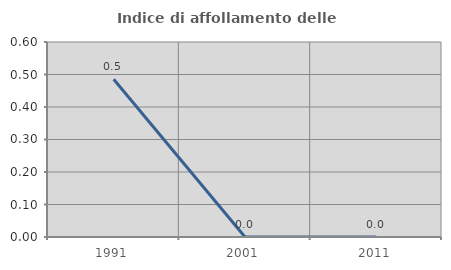
| Category | Indice di affollamento delle abitazioni  |
|---|---|
| 1991.0 | 0.485 |
| 2001.0 | 0 |
| 2011.0 | 0 |